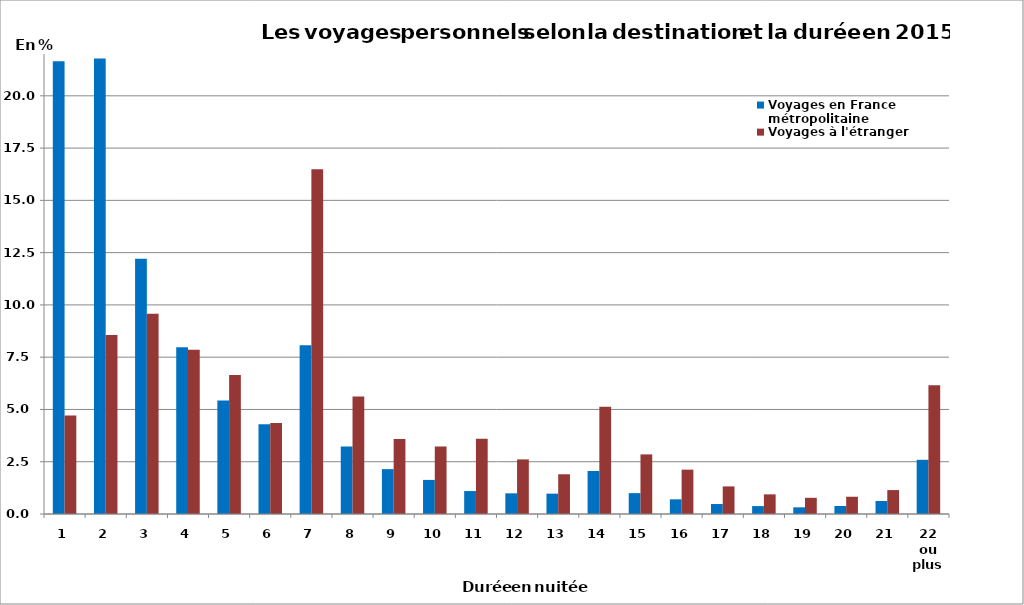
| Category | Voyages en France métropolitaine | Voyages à l'étranger |
|---|---|---|
| 1 | 21.654 | 4.709 |
| 2 | 21.785 | 8.564 |
| 3 | 12.208 | 9.579 |
| 4 | 7.976 | 7.858 |
| 5 | 5.434 | 6.642 |
| 6 | 4.287 | 4.355 |
| 7 | 8.069 | 16.487 |
| 8 | 3.229 | 5.625 |
| 9 | 2.146 | 3.586 |
| 10 | 1.63 | 3.232 |
| 11 | 1.097 | 3.594 |
| 12 | 0.988 | 2.611 |
| 13 | 0.973 | 1.9 |
| 14 | 2.056 | 5.126 |
| 15 | 0.998 | 2.851 |
| 16 | 0.701 | 2.121 |
| 17 | 0.477 | 1.32 |
| 18 | 0.379 | 0.939 |
| 19 | 0.318 | 0.775 |
| 20 | 0.384 | 0.825 |
| 21 | 0.621 | 1.144 |
| 22 ou plus | 2.591 | 6.157 |